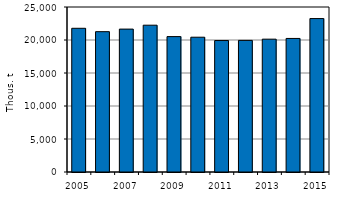
| Category | WASTE GENERATED BY ENTERPRISES  |
|---|---|
| 2005.0 | 21774 |
| 2006.0 | 21264 |
| 2007.0 | 21651 |
| 2008.0 | 22244 |
| 2009.0 | 20514 |
| 2010.0 | 20423 |
| 2011.0 | 19919 |
| 2012.0 | 19939 |
| 2013.0 | 20127 |
| 2014.0 | 20236 |
| 2015.0 | 23247 |